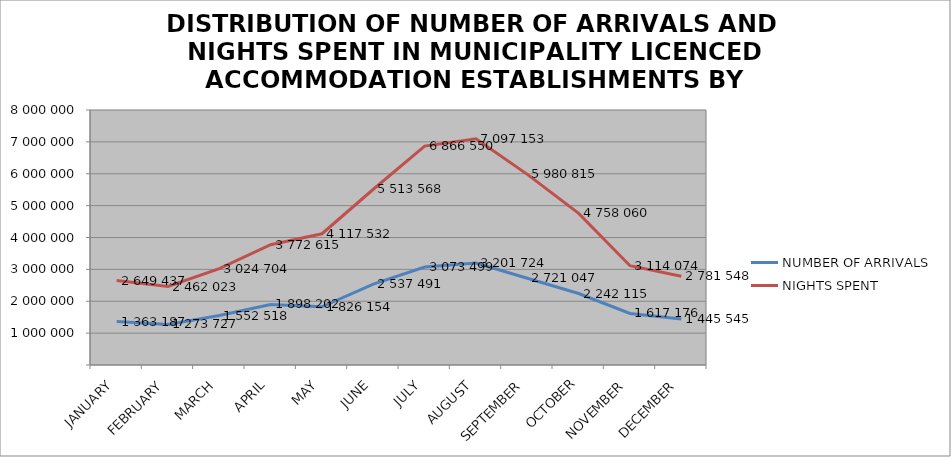
| Category | NUMBER OF ARRIVALS | NIGHTS SPENT |
|---|---|---|
| JANUARY | 1363187 | 2649437 |
| FEBRUARY | 1273727 | 2462023 |
| MARCH | 1552518 | 3024704 |
| APRIL | 1898202 | 3772615 |
| MAY | 1826154 | 4117532 |
| JUNE | 2537491 | 5513568 |
| JULY | 3073499 | 6866550 |
| AUGUST | 3201724 | 7097153 |
| SEPTEMBER | 2721047 | 5980815 |
| OCTOBER | 2242115 | 4758060 |
| NOVEMBER | 1617176 | 3114074 |
| DECEMBER | 1445545 | 2781548 |